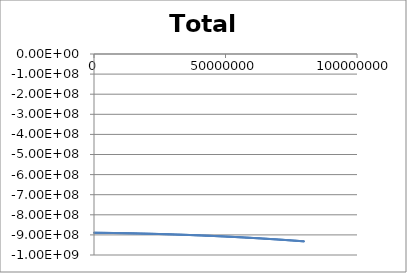
| Category | Total Energy |
|---|---|
| 0.0 | -889333333.33 |
| 160000.0 | -889355840.807 |
| 320000.0 | -889378580.408 |
| 480000.0 | -889401552.185 |
| 640000.0 | -889424756.192 |
| 800000.0 | -889448192.484 |
| 960000.0 | -889471861.115 |
| 1120000.0 | -889495762.142 |
| 1280000.0 | -889519895.619 |
| 1440000.0 | -889544261.603 |
| 1600000.0 | -889568860.152 |
| 1760000.0 | -889593691.323 |
| 1920000.0 | -889618755.174 |
| 2080000.0 | -889644051.764 |
| 2240000.0 | -889669581.152 |
| 2400000.0 | -889695343.397 |
| 2560000.0 | -889721338.561 |
| 2720000.0 | -889747566.704 |
| 2880000.0 | -889774027.888 |
| 3040000.0 | -889800722.174 |
| 3200000.0 | -889827649.626 |
| 3360000.0 | -889854810.306 |
| 3520000.0 | -889882204.278 |
| 3680000.0 | -889909831.607 |
| 3840000.0 | -889937692.357 |
| 4000000.0 | -889965786.593 |
| 4160000.0 | -889994114.382 |
| 4320000.0 | -890022675.79 |
| 4480000.0 | -890051470.884 |
| 4640000.0 | -890080499.732 |
| 4800000.0 | -890109762.401 |
| 4960000.0 | -890139258.961 |
| 5120000.0 | -890168989.481 |
| 5280000.0 | -890198954.031 |
| 5440000.0 | -890229152.681 |
| 5600000.0 | -890259585.503 |
| 5760000.0 | -890290252.567 |
| 5920000.0 | -890321153.946 |
| 6080000.0 | -890352289.712 |
| 6240000.0 | -890383659.939 |
| 6400000.0 | -890415264.701 |
| 6560000.0 | -890447104.072 |
| 6720000.0 | -890479178.126 |
| 6880000.0 | -890511486.94 |
| 7040000.0 | -890544030.59 |
| 7200000.0 | -890576809.152 |
| 7360000.0 | -890609822.703 |
| 7520000.0 | -890643071.321 |
| 7680000.0 | -890676555.085 |
| 7840000.0 | -890710274.073 |
| 8000000.0 | -890744228.365 |
| 8160000.0 | -890778418.041 |
| 8320000.0 | -890812843.181 |
| 8480000.0 | -890847503.867 |
| 8640000.0 | -890882400.181 |
| 8800000.0 | -890917532.205 |
| 8960000.0 | -890952900.021 |
| 9120000.0 | -890988503.714 |
| 9280000.0 | -891024343.368 |
| 9440000.0 | -891060419.066 |
| 9600000.0 | -891096730.895 |
| 9760000.0 | -891133278.939 |
| 9920000.0 | -891170063.287 |
| 10080000.0 | -891207084.023 |
| 10240000.0 | -891244341.237 |
| 10400000.0 | -891281835.015 |
| 10560000.0 | -891319565.448 |
| 10720000.0 | -891357532.623 |
| 10880000.0 | -891395736.631 |
| 11040000.0 | -891434177.563 |
| 11200000.0 | -891472855.508 |
| 11360000.0 | -891511770.56 |
| 11520000.0 | -891550922.81 |
| 11680000.0 | -891590312.35 |
| 11840000.0 | -891629939.275 |
| 12000000.0 | -891669803.678 |
| 12160000.0 | -891709905.653 |
| 12320000.0 | -891750245.297 |
| 12480000.0 | -891790822.703 |
| 12640000.0 | -891831637.97 |
| 12800000.0 | -891872691.192 |
| 12960000.0 | -891913982.469 |
| 13120000.0 | -891955511.898 |
| 13280000.0 | -891997279.577 |
| 13440000.0 | -892039285.607 |
| 13600000.0 | -892081530.086 |
| 13760000.0 | -892124013.115 |
| 13920000.0 | -892166734.795 |
| 14080000.0 | -892209695.228 |
| 14240000.0 | -892252894.516 |
| 14400000.0 | -892296332.761 |
| 14560000.0 | -892340010.068 |
| 14720000.0 | -892383926.539 |
| 14880000.0 | -892428082.28 |
| 15040000.0 | -892472477.396 |
| 15200000.0 | -892517111.992 |
| 15360000.0 | -892561986.175 |
| 15520000.0 | -892607100.051 |
| 15680000.0 | -892652453.729 |
| 15840000.0 | -892698047.316 |
| 16000000.0 | -892743880.922 |
| 16160000.0 | -892789954.655 |
| 16320000.0 | -892836268.626 |
| 16480000.0 | -892882822.945 |
| 16640000.0 | -892929617.723 |
| 16800000.0 | -892976653.072 |
| 16960000.0 | -893023929.105 |
| 17120000.0 | -893071445.934 |
| 17280000.0 | -893119203.674 |
| 17440000.0 | -893167202.437 |
| 17600000.0 | -893215442.34 |
| 17760000.0 | -893263923.497 |
| 17920000.0 | -893312646.024 |
| 18080000.0 | -893361610.039 |
| 18240000.0 | -893410815.658 |
| 18400000.0 | -893460262.999 |
| 18560000.0 | -893509952.181 |
| 18720000.0 | -893559883.323 |
| 18880000.0 | -893610056.545 |
| 19040000.0 | -893660471.966 |
| 19200000.0 | -893711129.709 |
| 19360000.0 | -893762029.894 |
| 19520000.0 | -893813172.643 |
| 19680000.0 | -893864558.08 |
| 19840000.0 | -893916186.328 |
| 20000000.0 | -893968057.51 |
| 20160000.0 | -894020171.752 |
| 20320000.0 | -894072529.179 |
| 20480000.0 | -894125129.917 |
| 20640000.0 | -894177974.092 |
| 20800000.0 | -894231061.831 |
| 20960000.0 | -894284393.263 |
| 21120000.0 | -894337968.515 |
| 21280000.0 | -894391787.717 |
| 21440000.0 | -894445850.998 |
| 21600000.0 | -894500158.489 |
| 21760000.0 | -894554710.321 |
| 21920000.0 | -894609506.624 |
| 22080000.0 | -894664547.533 |
| 22240000.0 | -894719833.178 |
| 22400000.0 | -894775363.694 |
| 22560000.0 | -894831139.214 |
| 22720000.0 | -894887159.874 |
| 22880000.0 | -894943425.809 |
| 23040000.0 | -894999937.155 |
| 23200000.0 | -895056694.048 |
| 23360000.0 | -895113696.626 |
| 23520000.0 | -895170945.027 |
| 23680000.0 | -895228439.389 |
| 23840000.0 | -895286179.851 |
| 24000000.0 | -895344166.554 |
| 24160000.0 | -895402399.638 |
| 24320000.0 | -895460879.244 |
| 24480000.0 | -895519605.513 |
| 24640000.0 | -895578578.589 |
| 24800000.0 | -895637798.614 |
| 24960000.0 | -895697265.732 |
| 25120000.0 | -895756980.087 |
| 25280000.0 | -895816941.825 |
| 25440000.0 | -895877151.091 |
| 25600000.0 | -895937608.032 |
| 25760000.0 | -895998312.794 |
| 25920000.0 | -896059265.525 |
| 26080000.0 | -896120466.373 |
| 26240000.0 | -896181915.489 |
| 26400000.0 | -896243613.02 |
| 26560000.0 | -896305559.117 |
| 26720000.0 | -896367753.932 |
| 26880000.0 | -896430197.615 |
| 27040000.0 | -896492890.32 |
| 27200000.0 | -896555832.199 |
| 27360000.0 | -896619023.405 |
| 27520000.0 | -896682464.094 |
| 27680000.0 | -896746154.419 |
| 27840000.0 | -896810094.537 |
| 28000000.0 | -896874284.603 |
| 28160000.0 | -896938724.775 |
| 28320000.0 | -897003415.211 |
| 28480000.0 | -897068356.067 |
| 28640000.0 | -897133547.505 |
| 28800000.0 | -897198989.682 |
| 28960000.0 | -897264682.76 |
| 29120000.0 | -897330626.9 |
| 29280000.0 | -897396822.262 |
| 29440000.0 | -897463269.01 |
| 29600000.0 | -897529967.307 |
| 29760000.0 | -897596917.315 |
| 29920000.0 | -897664119.2 |
| 30080000.0 | -897731573.126 |
| 30240000.0 | -897799279.26 |
| 30400000.0 | -897867237.768 |
| 30560000.0 | -897935448.816 |
| 30720000.0 | -898003912.573 |
| 30880000.0 | -898072629.207 |
| 31040000.0 | -898141598.888 |
| 31200000.0 | -898210821.785 |
| 31360000.0 | -898280298.068 |
| 31520000.0 | -898350027.91 |
| 31680000.0 | -898420011.482 |
| 31840000.0 | -898490248.956 |
| 32000000.0 | -898560740.506 |
| 32160000.0 | -898631486.307 |
| 32320000.0 | -898702486.532 |
| 32480000.0 | -898773741.358 |
| 32640000.0 | -898845250.96 |
| 32800000.0 | -898917015.516 |
| 32960000.0 | -898989035.202 |
| 33120000.0 | -899061310.198 |
| 33280000.0 | -899133840.682 |
| 33440000.0 | -899206626.833 |
| 33600000.0 | -899279668.833 |
| 33760000.0 | -899352966.863 |
| 33920000.0 | -899426521.103 |
| 34080000.0 | -899500331.737 |
| 34240000.0 | -899574398.948 |
| 34400000.0 | -899648722.921 |
| 34560000.0 | -899723303.838 |
| 34720000.0 | -899798141.887 |
| 34880000.0 | -899873237.253 |
| 35040000.0 | -899948590.123 |
| 35200000.0 | -900024200.685 |
| 35360000.0 | -900100069.127 |
| 35520000.0 | -900176195.637 |
| 35680000.0 | -900252580.406 |
| 35840000.0 | -900329223.625 |
| 36000000.0 | -900406125.484 |
| 36160000.0 | -900483286.175 |
| 36320000.0 | -900560705.891 |
| 36480000.0 | -900638384.825 |
| 36640000.0 | -900716323.172 |
| 36800000.0 | -900794521.127 |
| 36960000.0 | -900872978.885 |
| 37120000.0 | -900951696.642 |
| 37280000.0 | -901030674.595 |
| 37440000.0 | -901109912.943 |
| 37600000.0 | -901189411.884 |
| 37760000.0 | -901269171.617 |
| 37920000.0 | -901349192.342 |
| 38080000.0 | -901429474.261 |
| 38240000.0 | -901510017.574 |
| 38400000.0 | -901590822.485 |
| 38560000.0 | -901671889.195 |
| 38720000.0 | -901753217.91 |
| 38880000.0 | -901834808.833 |
| 39040000.0 | -901916662.17 |
| 39200000.0 | -901998778.128 |
| 39360000.0 | -902081156.912 |
| 39520000.0 | -902163798.73 |
| 39680000.0 | -902246703.792 |
| 39840000.0 | -902329872.306 |
| 40000000.0 | -902413304.481 |
| 40160000.0 | -902497000.53 |
| 40320000.0 | -902580960.662 |
| 40480000.0 | -902665185.091 |
| 40640000.0 | -902749674.03 |
| 40800000.0 | -902834427.691 |
| 40960000.0 | -902919446.291 |
| 41120000.0 | -903004730.043 |
| 41280000.0 | -903090279.165 |
| 41440000.0 | -903176093.872 |
| 41600000.0 | -903262174.383 |
| 41760000.0 | -903348520.917 |
| 41920000.0 | -903435133.691 |
| 42080000.0 | -903522012.928 |
| 42240000.0 | -903609158.846 |
| 42400000.0 | -903696571.668 |
| 42560000.0 | -903784251.617 |
| 42720000.0 | -903872198.915 |
| 42880000.0 | -903960413.786 |
| 43040000.0 | -904048896.456 |
| 43200000.0 | -904137647.149 |
| 43360000.0 | -904226666.092 |
| 43520000.0 | -904315953.513 |
| 43680000.0 | -904405509.639 |
| 43840000.0 | -904495334.698 |
| 44000000.0 | -904585428.922 |
| 44160000.0 | -904675792.54 |
| 44320000.0 | -904766425.782 |
| 44480000.0 | -904857328.883 |
| 44640000.0 | -904948502.073 |
| 44800000.0 | -905039945.587 |
| 44960000.0 | -905131659.659 |
| 45120000.0 | -905223644.524 |
| 45280000.0 | -905315900.419 |
| 45440000.0 | -905408427.581 |
| 45600000.0 | -905501226.247 |
| 45760000.0 | -905594296.656 |
| 45920000.0 | -905687639.047 |
| 46080000.0 | -905781253.66 |
| 46240000.0 | -905875140.737 |
| 46400000.0 | -905969300.52 |
| 46560000.0 | -906063733.25 |
| 46720000.0 | -906158439.172 |
| 46880000.0 | -906253418.531 |
| 47040000.0 | -906348671.57 |
| 47200000.0 | -906444198.537 |
| 47360000.0 | -906539999.679 |
| 47520000.0 | -906636075.242 |
| 47680000.0 | -906732425.477 |
| 47840000.0 | -906829050.631 |
| 48000000.0 | -906925950.956 |
| 48160000.0 | -907023126.703 |
| 48320000.0 | -907120578.124 |
| 48480000.0 | -907218305.471 |
| 48640000.0 | -907316308.998 |
| 48800000.0 | -907414588.961 |
| 48960000.0 | -907513145.614 |
| 49120000.0 | -907611979.214 |
| 49280000.0 | -907711090.017 |
| 49440000.0 | -907810478.283 |
| 49600000.0 | -907910144.27 |
| 49760000.0 | -908010088.237 |
| 49920000.0 | -908110310.446 |
| 50080000.0 | -908210811.158 |
| 50240000.0 | -908311590.636 |
| 50400000.0 | -908412649.142 |
| 50560000.0 | -908513986.941 |
| 50720000.0 | -908615604.299 |
| 50880000.0 | -908717501.48 |
| 51040000.0 | -908819678.753 |
| 51200000.0 | -908922136.384 |
| 51360000.0 | -909024874.642 |
| 51520000.0 | -909127893.797 |
| 51680000.0 | -909231194.12 |
| 51840000.0 | -909334775.881 |
| 52000000.0 | -909438639.353 |
| 52160000.0 | -909542784.809 |
| 52320000.0 | -909647212.523 |
| 52480000.0 | -909751922.769 |
| 52640000.0 | -909856915.825 |
| 52800000.0 | -909962191.967 |
| 52960000.0 | -910067751.471 |
| 53120000.0 | -910173594.618 |
| 53280000.0 | -910279721.686 |
| 53440000.0 | -910386132.956 |
| 53600000.0 | -910492828.709 |
| 53760000.0 | -910599809.228 |
| 53920000.0 | -910707074.795 |
| 54080000.0 | -910814625.696 |
| 54240000.0 | -910922462.214 |
| 54400000.0 | -911030584.636 |
| 54560000.0 | -911138993.249 |
| 54720000.0 | -911247688.341 |
| 54880000.0 | -911356670.2 |
| 55040000.0 | -911465939.117 |
| 55200000.0 | -911575495.382 |
| 55360000.0 | -911685339.287 |
| 55520000.0 | -911795471.123 |
| 55680000.0 | -911905891.186 |
| 55840000.0 | -912016599.769 |
| 56000000.0 | -912127597.168 |
| 56160000.0 | -912238883.679 |
| 56320000.0 | -912350459.6 |
| 56480000.0 | -912462325.229 |
| 56640000.0 | -912574480.865 |
| 56800000.0 | -912686926.809 |
| 56960000.0 | -912799663.361 |
| 57120000.0 | -912912690.825 |
| 57280000.0 | -913026009.503 |
| 57440000.0 | -913139619.699 |
| 57600000.0 | -913253521.719 |
| 57760000.0 | -913367715.868 |
| 57920000.0 | -913482202.454 |
| 58080000.0 | -913596981.786 |
| 58240000.0 | -913712054.171 |
| 58400000.0 | -913827419.92 |
| 58560000.0 | -913943079.345 |
| 58720000.0 | -914059032.757 |
| 58880000.0 | -914175280.469 |
| 59040000.0 | -914291822.796 |
| 59200000.0 | -914408660.053 |
| 59360000.0 | -914525792.555 |
| 59520000.0 | -914643220.619 |
| 59680000.0 | -914760944.565 |
| 59840000.0 | -914878964.71 |
| 60000000.0 | -914997281.376 |
| 60160000.0 | -915115894.883 |
| 60320000.0 | -915234805.554 |
| 60480000.0 | -915354013.711 |
| 60640000.0 | -915473519.679 |
| 60800000.0 | -915593323.783 |
| 60960000.0 | -915713426.35 |
| 61120000.0 | -915833827.707 |
| 61280000.0 | -915954528.182 |
| 61440000.0 | -916075528.105 |
| 61600000.0 | -916196827.806 |
| 61760000.0 | -916318427.617 |
| 61920000.0 | -916440327.869 |
| 62080000.0 | -916562528.898 |
| 62240000.0 | -916685031.037 |
| 62400000.0 | -916807834.622 |
| 62560000.0 | -916930939.991 |
| 62720000.0 | -917054347.48 |
| 62880000.0 | -917178057.429 |
| 63040000.0 | -917302070.178 |
| 63200000.0 | -917426386.067 |
| 63360000.0 | -917551005.439 |
| 63520000.0 | -917675928.638 |
| 63680000.0 | -917801156.007 |
| 63840000.0 | -917926687.891 |
| 64000000.0 | -918052524.638 |
| 64160000.0 | -918178666.595 |
| 64320000.0 | -918305114.109 |
| 64480000.0 | -918431867.532 |
| 64640000.0 | -918558927.214 |
| 64800000.0 | -918686293.507 |
| 64960000.0 | -918813966.763 |
| 65120000.0 | -918941947.338 |
| 65280000.0 | -919070235.585 |
| 65440000.0 | -919198831.863 |
| 65600000.0 | -919327736.527 |
| 65760000.0 | -919456949.936 |
| 65920000.0 | -919586472.451 |
| 66080000.0 | -919716304.432 |
| 66240000.0 | -919846446.241 |
| 66400000.0 | -919976898.241 |
| 66560000.0 | -920107660.797 |
| 66720000.0 | -920238734.273 |
| 66880000.0 | -920370119.036 |
| 67040000.0 | -920501815.454 |
| 67200000.0 | -920633823.895 |
| 67360000.0 | -920766144.73 |
| 67520000.0 | -920898778.329 |
| 67680000.0 | -921031725.065 |
| 67840000.0 | -921164985.311 |
| 68000000.0 | -921298559.442 |
| 68160000.0 | -921432447.833 |
| 68320000.0 | -921566650.861 |
| 68480000.0 | -921701168.904 |
| 68640000.0 | -921836002.342 |
| 68800000.0 | -921971151.554 |
| 68960000.0 | -922106616.923 |
| 69120000.0 | -922242398.831 |
| 69280000.0 | -922378497.662 |
| 69440000.0 | -922514913.801 |
| 69600000.0 | -922651647.634 |
| 69760000.0 | -922788699.55 |
| 69920000.0 | -922926069.936 |
| 70080000.0 | -923063759.183 |
| 70240000.0 | -923201767.682 |
| 70400000.0 | -923340095.824 |
| 70560000.0 | -923478744.004 |
| 70720000.0 | -923617712.617 |
| 70880000.0 | -923757002.058 |
| 71040000.0 | -923896612.724 |
| 71200000.0 | -924036545.014 |
| 71360000.0 | -924176799.328 |
| 71520000.0 | -924317376.066 |
| 71680000.0 | -924458275.631 |
| 71840000.0 | -924599498.426 |
| 72000000.0 | -924741044.856 |
| 72160000.0 | -924882915.325 |
| 72320000.0 | -925025110.243 |
| 72480000.0 | -925167630.016 |
| 72640000.0 | -925310475.055 |
| 72800000.0 | -925453645.77 |
| 72960000.0 | -925597142.573 |
| 73120000.0 | -925740965.879 |
| 73280000.0 | -925885116.101 |
| 73440000.0 | -926029593.655 |
| 73600000.0 | -926174398.96 |
| 73760000.0 | -926319532.433 |
| 73920000.0 | -926464994.494 |
| 74080000.0 | -926610785.564 |
| 74240000.0 | -926756906.065 |
| 74400000.0 | -926903356.422 |
| 74560000.0 | -927050137.06 |
| 74720000.0 | -927197248.404 |
| 74880000.0 | -927344690.882 |
| 75040000.0 | -927492464.923 |
| 75200000.0 | -927640570.958 |
| 75360000.0 | -927789009.417 |
| 75520000.0 | -927937780.734 |
| 75680000.0 | -928086885.344 |
| 75840000.0 | -928236323.681 |
| 76000000.0 | -928386096.182 |
| 76160000.0 | -928536203.286 |
| 76320000.0 | -928686645.432 |
| 76480000.0 | -928837423.061 |
| 76640000.0 | -928988536.615 |
| 76800000.0 | -929139986.539 |
| 76960000.0 | -929291773.276 |
| 77120000.0 | -929443897.274 |
| 77280000.0 | -929596358.98 |
| 77440000.0 | -929749158.843 |
| 77600000.0 | -929902297.313 |
| 77760000.0 | -930055774.843 |
| 77920000.0 | -930209591.885 |
| 78080000.0 | -930363748.894 |
| 78240000.0 | -930518246.327 |
| 78400000.0 | -930673084.64 |
| 78560000.0 | -930828264.293 |
| 78720000.0 | -930983785.745 |
| 78880000.0 | -931139649.458 |
| 79040000.0 | -931295855.896 |
| 79200000.0 | -931452405.522 |
| 79360000.0 | -931609298.803 |
| 79520000.0 | -931766536.205 |
| 79680000.0 | -931924118.198 |
| 79840000.0 | -932082045.251 |